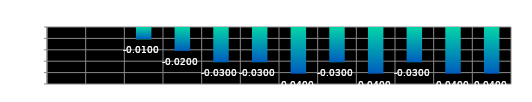
| Category | Series 0 |
|---|---|
| 0 | 0 |
| 1 | 0 |
| 2 | -0.01 |
| 3 | -0.02 |
| 4 | -0.03 |
| 5 | -0.03 |
| 6 | -0.04 |
| 7 | -0.03 |
| 8 | -0.04 |
| 9 | -0.03 |
| 10 | -0.04 |
| 11 | -0.04 |